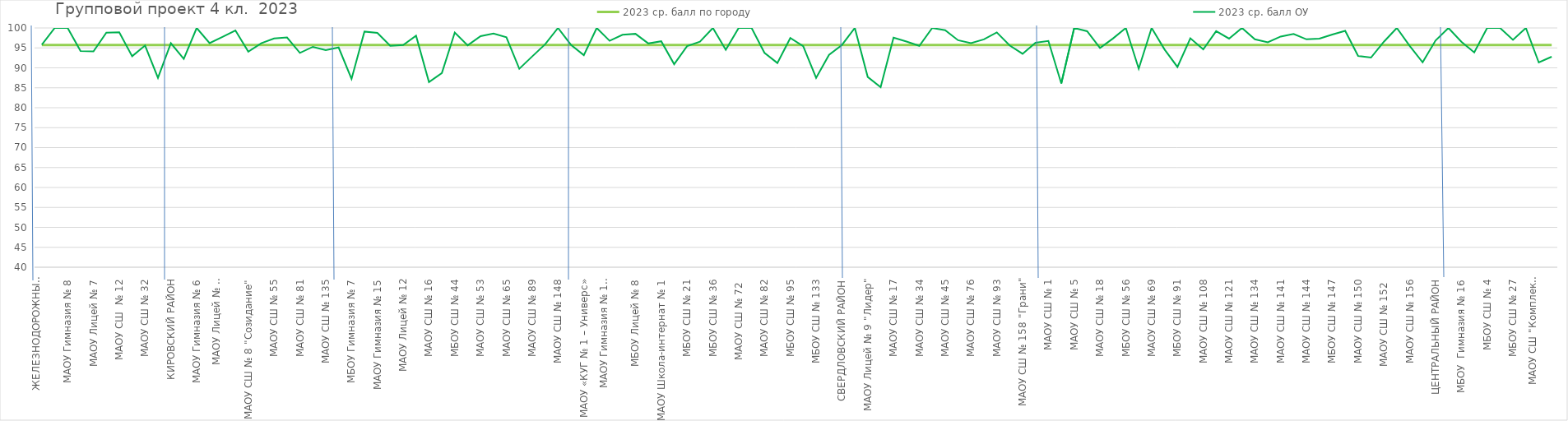
| Category | 2023 ср. балл по городу | 2023 ср. балл ОУ |
|---|---|---|
| ЖЕЛЕЗНОДОРОЖНЫЙ РАЙОН | 95.71 | 95.788 |
| МБОУ Прогимназия  № 131 | 95.71 | 100 |
| МАОУ Гимназия № 8 | 95.71 | 100 |
| МАОУ Гимназия №  9 | 95.71 | 94.231 |
| МАОУ Лицей № 7 | 95.71 | 94.118 |
| МАОУ Лицей № 28 | 95.71 | 98.824 |
| МАОУ СШ  № 12 | 95.71 | 98.901 |
| МАОУ СШ № 19 | 95.71 | 92.913 |
| МАОУ СШ № 32 | 95.71 | 95.604 |
| МБОУ СШ № 86  | 95.71 | 87.5 |
| КИРОВСКИЙ РАЙОН | 95.71 | 96.186 |
| МАОУ Гимназия № 4 | 95.71 | 92.233 |
| МАОУ Гимназия № 6 | 95.71 | 100 |
| МАОУ Гимназия № 10 | 95.71 | 96.19 |
| МАОУ Лицей № 6 "Перспектива" | 95.71 | 97.778 |
| МАОУ Лицей № 11 | 95.71 | 99.367 |
| МАОУ СШ № 8 "Созидание" | 95.71 | 94.059 |
| МАОУ СШ № 46 | 95.71 | 96.154 |
| МАОУ СШ № 55 | 95.71 | 97.368 |
| МБОУ СШ № 63 | 95.71 | 97.619 |
| МАОУ СШ № 81 | 95.71 | 93.75 |
| МАОУ СШ № 90 | 95.71 | 95.27 |
| МАОУ СШ № 135 | 95.71 | 94.444 |
| ЛЕНИНСКИЙ РАЙОН | 95.71 | 95.103 |
| МБОУ Гимназия № 7 | 95.71 | 87.234 |
| МАОУ Гимназия № 11  | 95.71 | 99.083 |
| МАОУ Гимназия № 15 | 95.71 | 98.765 |
| МАОУ Лицей № 3 | 95.71 | 95.536 |
| МАОУ Лицей № 12 | 95.71 | 95.714 |
| МБОУ СШ № 13 | 95.71 | 98.039 |
| МАОУ СШ № 16 | 95.71 | 86.429 |
| МБОУ СШ № 31 | 95.71 | 88.679 |
| МБОУ СШ № 44 | 95.71 | 98.864 |
| МАОУ СШ № 50 | 95.71 | 95.652 |
| МАОУ СШ № 53 | 95.71 | 97.938 |
| МБОУ СШ № 64 | 95.71 | 98.611 |
| МАОУ СШ № 65 | 95.71 | 97.674 |
| МБОУ СШ № 79 | 95.71 | 89.773 |
| МАОУ СШ № 89 | 95.71 | 92.857 |
| МБОУ СШ № 94 | 95.71 | 95.902 |
| МАОУ СШ № 148 | 95.71 | 100 |
| ОКТЯБРЬСКИЙ РАЙОН | 95.71 | 95.782 |
| МАОУ «КУГ № 1 – Универс» | 95.71 | 93.173 |
| МБОУ Гимназия № 3 | 95.71 | 100 |
| МАОУ Гимназия № 13 "Академ" | 95.71 | 96.774 |
| МАОУ Лицей № 1 | 95.71 | 98.298 |
| МБОУ Лицей № 8 | 95.71 | 98.529 |
| МБОУ Лицей № 10 | 95.71 | 96.117 |
| МАОУ Школа-интернат № 1 | 95.71 | 96.667 |
| МАОУ СШ № 3 | 95.71 | 90.909 |
| МБОУ СШ № 21 | 95.71 | 95.455 |
| МБОУ СШ № 30 | 95.71 | 96.552 |
| МБОУ СШ № 36 | 95.71 | 100 |
| МБОУ СШ № 39 | 95.71 | 94.545 |
| МАОУ СШ № 72  | 95.71 | 100 |
| МБОУ СШ № 73 | 95.71 | 100 |
| МАОУ СШ № 82 | 95.71 | 93.75 |
| МБОУ СШ № 84 | 95.71 | 91.209 |
| МБОУ СШ № 95 | 95.71 | 97.479 |
| МБОУ СШ № 99 | 95.71 | 95.42 |
| МБОУ СШ № 133 | 95.71 | 87.5 |
| МАОУ СШ № 159 | 95.71 | 93.269 |
| СВЕРДЛОВСКИЙ РАЙОН | 95.71 | 95.732 |
| МАОУ Гимназия № 14 | 95.71 | 100 |
| МАОУ Лицей № 9 "Лидер" | 95.71 | 87.719 |
| МАОУ СШ № 6 | 95.71 | 85.149 |
| МАОУ СШ № 17 | 95.71 | 97.59 |
| МАОУ СШ № 23 | 95.71 | 96.591 |
| МАОУ СШ № 34 | 95.71 | 95.506 |
| МАОУ СШ № 42 | 95.71 | 100 |
| МАОУ СШ № 45 | 95.71 | 99.422 |
| МБОУ СШ № 62 | 95.71 | 96.923 |
| МАОУ СШ № 76 | 95.71 | 96.196 |
| МАОУ СШ № 78 | 95.71 | 97.143 |
| МАОУ СШ № 93 | 95.71 | 98.889 |
| МАОУ СШ № 137 | 95.71 | 95.614 |
| МАОУ СШ № 158 "Грани" | 95.71 | 93.514 |
| СОВЕТСКИЙ РАЙОН | 95.71 | 96.283 |
| МАОУ СШ № 1 | 95.71 | 96.739 |
| МБОУ СШ № 2 | 95.71 | 86.076 |
| МАОУ СШ № 5 | 95.71 | 100 |
| МАОУ СШ № 7 | 95.71 | 99.187 |
| МАОУ СШ № 18 | 95.71 | 94.969 |
| МАОУ СШ № 24 | 95.71 | 97.345 |
| МБОУ СШ № 56 | 95.71 | 100 |
| МАОУ СШ № 66 | 95.71 | 89.796 |
| МАОУ СШ № 69 | 95.71 | 100 |
| МАОУ СШ № 85 | 95.71 | 94.615 |
| МБОУ СШ № 91 | 95.71 | 90.217 |
| МБОУ СШ № 98 | 95.71 | 97.403 |
| МАОУ СШ № 108 | 95.71 | 94.631 |
| МАОУ СШ № 115 | 95.71 | 99.213 |
| МАОУ СШ № 121 | 95.71 | 97.333 |
| МБОУ СШ № 129 | 95.71 | 100 |
| МАОУ СШ № 134 | 95.71 | 97.163 |
| МАОУ СШ № 139 | 95.71 | 96.386 |
| МАОУ СШ № 141 | 95.71 | 97.849 |
| МАОУ СШ № 143 | 95.71 | 98.479 |
| МАОУ СШ № 144 | 95.71 | 97.154 |
| МАОУ СШ № 145 | 95.71 | 97.326 |
| МБОУ СШ № 147 | 95.71 | 98.361 |
| МАОУ СШ № 149 | 95.71 | 99.273 |
| МАОУ СШ № 150 | 95.71 | 92.982 |
| МАОУ СШ № 151 | 95.71 | 92.571 |
| МАОУ СШ № 152  | 95.71 | 96.552 |
| МАОУ СШ № 154 | 95.71 | 100 |
| МАОУ СШ № 156 | 95.71 | 95.479 |
| МАОУ СШ № 157 | 95.71 | 91.391 |
| ЦЕНТРАЛЬНЫЙ РАЙОН | 95.71 | 96.841 |
| МАОУ Гимназия № 2 | 95.71 | 100 |
| МБОУ  Гимназия № 16 | 95.71 | 96.552 |
| МБОУ Лицей № 2 | 95.71 | 93.878 |
| МБОУ СШ № 4 | 95.71 | 100 |
| МБОУ СШ № 10  | 95.71 | 100 |
| МБОУ СШ № 27 | 95.71 | 97.015 |
| МБОУ СШ № 51 | 95.71 | 100 |
| МАОУ СШ "Комплекс Покровский" | 95.71 | 91.337 |
| МБОУ СШ " 155 | 95.71 | 92.787 |